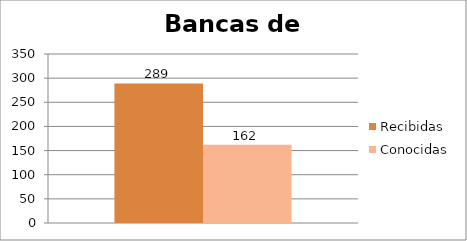
| Category | Recibidas | Conocidas |
|---|---|---|
| 0 | 289 | 162 |